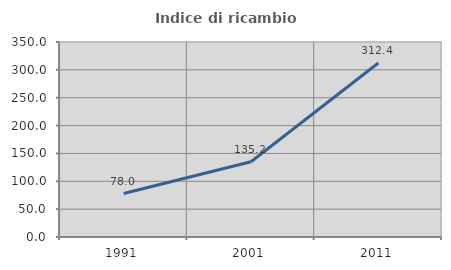
| Category | Indice di ricambio occupazionale  |
|---|---|
| 1991.0 | 78.008 |
| 2001.0 | 135.162 |
| 2011.0 | 312.4 |